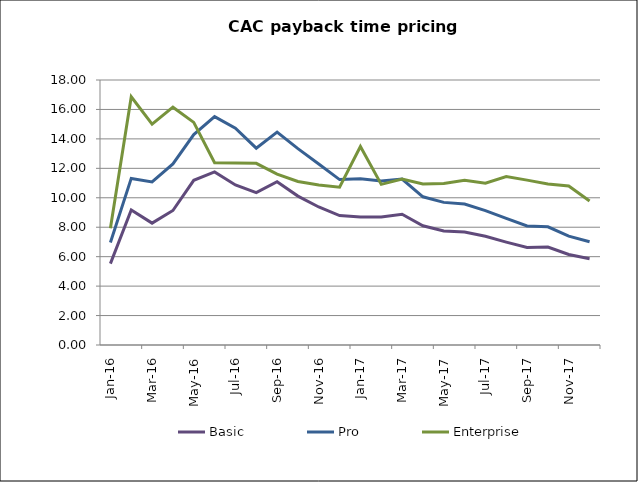
| Category | Basic | Pro | Enterprise |
|---|---|---|---|
| 2016-01-01 | 5.53 | 6.968 | 7.927 |
| 2016-02-01 | 9.175 | 11.316 | 16.858 |
| 2016-03-01 | 8.278 | 11.079 | 15.004 |
| 2016-04-01 | 9.136 | 12.303 | 16.153 |
| 2016-05-01 | 11.187 | 14.295 | 15.12 |
| 2016-06-01 | 11.754 | 15.515 | 12.379 |
| 2016-07-01 | 10.873 | 14.729 | 12.366 |
| 2016-08-01 | 10.345 | 13.369 | 12.341 |
| 2016-09-01 | 11.092 | 14.457 | 11.605 |
| 2016-10-01 | 10.114 | 13.338 | 11.105 |
| 2016-11-01 | 9.375 | 12.292 | 10.868 |
| 2016-12-01 | 8.791 | 11.236 | 10.719 |
| 2017-01-01 | 8.696 | 11.286 | 13.48 |
| 2017-02-01 | 8.702 | 11.139 | 10.911 |
| 2017-03-01 | 8.882 | 11.272 | 11.278 |
| 2017-04-01 | 8.101 | 10.066 | 10.936 |
| 2017-05-01 | 7.74 | 9.687 | 10.973 |
| 2017-06-01 | 7.677 | 9.575 | 11.189 |
| 2017-07-01 | 7.385 | 9.124 | 10.995 |
| 2017-08-01 | 6.988 | 8.597 | 11.442 |
| 2017-09-01 | 6.62 | 8.085 | 11.198 |
| 2017-10-01 | 6.65 | 8.031 | 10.935 |
| 2017-11-01 | 6.145 | 7.396 | 10.798 |
| 2017-12-01 | 5.858 | 7.011 | 9.779 |